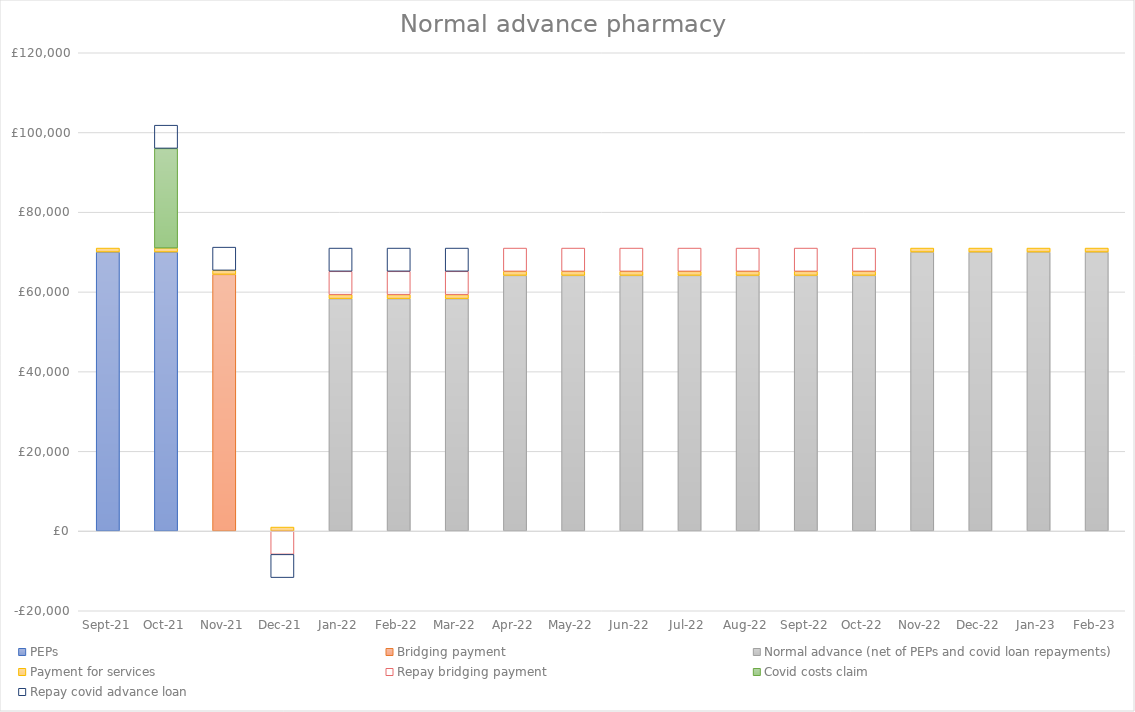
| Category | PEPs | Bridging payment | Normal advance (net of PEPs and covid loan repayments) | Payment for services | Repay bridging payment | Covid costs claim | Repay covid advance loan |
|---|---|---|---|---|---|---|---|
| 2021-09-01 | 70000 | 0 | 0 | 1000 | 0 | 0 | 0 |
| 2021-10-01 | 70000 | 0 | 0 | 1000 | 0 | 25000 | 5833.333 |
| 2021-11-01 | 0 | 64400 | 0 | 1000 | 0 | 0 | 5833.333 |
| 2021-12-01 | 0 | 0 | 0 | 1000 | -5854.545 | 0 | -5833.333 |
| 2022-01-01 | 0 | 0 | 58312.121 | 1000 | 5854.545 | 0 | 5833.333 |
| 2022-02-01 | 0 | 0 | 58312.121 | 1000 | 5854.545 | 0 | 5833.333 |
| 2022-03-01 | 0 | 0 | 58312.121 | 1000 | 5854.545 | 0 | 5833.333 |
| 2022-04-01 | 0 | 0 | 64145.455 | 1000 | 5854.545 | 0 | 0 |
| 2022-05-01 | 0 | 0 | 64145.455 | 1000 | 5854.545 | 0 | 0 |
| 2022-06-01 | 0 | 0 | 64145.455 | 1000 | 5854.545 | 0 | 0 |
| 2022-07-01 | 0 | 0 | 64145.455 | 1000 | 5854.545 | 0 | 0 |
| 2022-08-01 | 0 | 0 | 64145.455 | 1000 | 5854.545 | 0 | 0 |
| 2022-09-01 | 0 | 0 | 64145.455 | 1000 | 5854.545 | 0 | 0 |
| 2022-10-01 | 0 | 0 | 64145.455 | 1000 | 5854.545 | 0 | 0 |
| 2022-11-01 | 0 | 0 | 70000 | 1000 | 0 | 0 | 0 |
| 2022-12-01 | 0 | 0 | 70000 | 1000 | 0 | 0 | 0 |
| 2023-01-01 | 0 | 0 | 70000 | 1000 | 0 | 0 | 0 |
| 2023-02-01 | 0 | 0 | 70000 | 1000 | 0 | 0 | 0 |